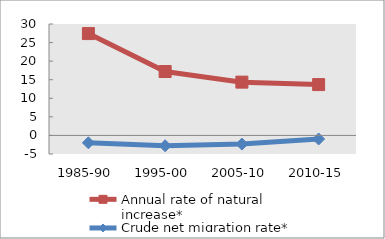
| Category | Annual rate of natural increase* | Crude net migration rate* |
|---|---|---|
| 1985-90 | 27.42 | -1.99 |
| 1995-00 | 17.204 | -2.777 |
| 2005-10 | 14.349 | -2.331 |
| 2010-15 | 13.691 | -0.96 |